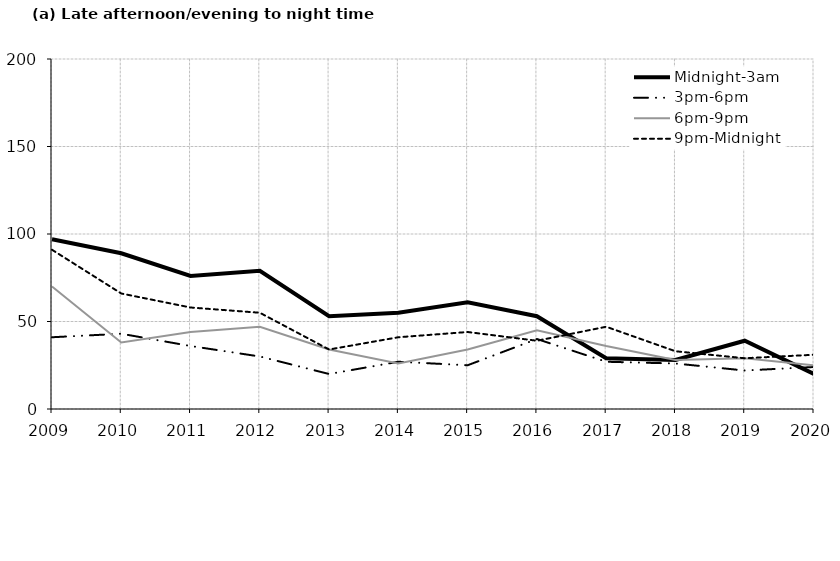
| Category | Midnight-3am | 3pm-6pm | 6pm-9pm | 9pm-Midnight |
|---|---|---|---|---|
| 2009.0 | 97 | 41 | 70 | 91 |
| 2010.0 | 89 | 43 | 38 | 66 |
| 2011.0 | 76 | 36 | 44 | 58 |
| 2012.0 | 79 | 30 | 47 | 55 |
| 2013.0 | 53 | 20 | 34 | 34 |
| 2014.0 | 55 | 27 | 26 | 41 |
| 2015.0 | 61 | 25 | 34 | 44 |
| 2016.0 | 53 | 40 | 45 | 39 |
| 2017.0 | 29 | 27 | 36 | 47 |
| 2018.0 | 28 | 26 | 28 | 33 |
| 2019.0 | 39 | 22 | 29 | 29 |
| 2020.0 | 20 | 24 | 25 | 31 |